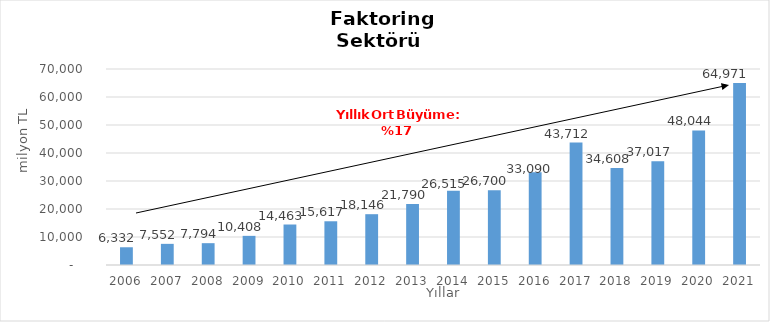
| Category | Faktoring  |
|---|---|
| 2006.0 | 6331.998 |
| 2007.0 | 7552.18 |
| 2008.0 | 7794.497 |
| 2009.0 | 10407.622 |
| 2010.0 | 14462.609 |
| 2011.0 | 15617.092 |
| 2012.0 | 18146.479 |
| 2013.0 | 21790.367 |
| 2014.0 | 26515 |
| 2015.0 | 26700 |
| 2016.0 | 33090 |
| 2017.0 | 43712 |
| 2018.0 | 34608 |
| 2019.0 | 37017 |
| 2020.0 | 48044 |
| 2021.0 | 64971 |